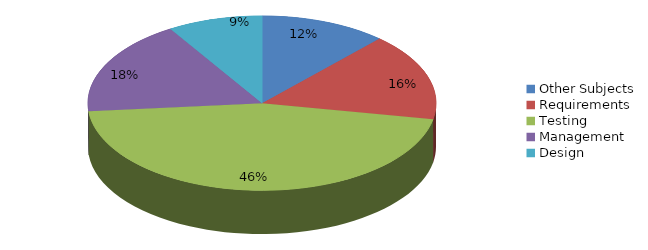
| Category | Nro Trabalhos |
|---|---|
| Other Subjects | 8 |
| Requirements | 11 |
| Testing | 31 |
| Management | 12 |
| Design | 6 |